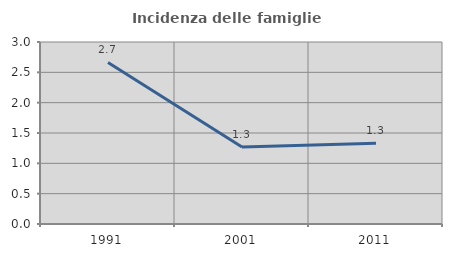
| Category | Incidenza delle famiglie numerose |
|---|---|
| 1991.0 | 2.663 |
| 2001.0 | 1.271 |
| 2011.0 | 1.333 |